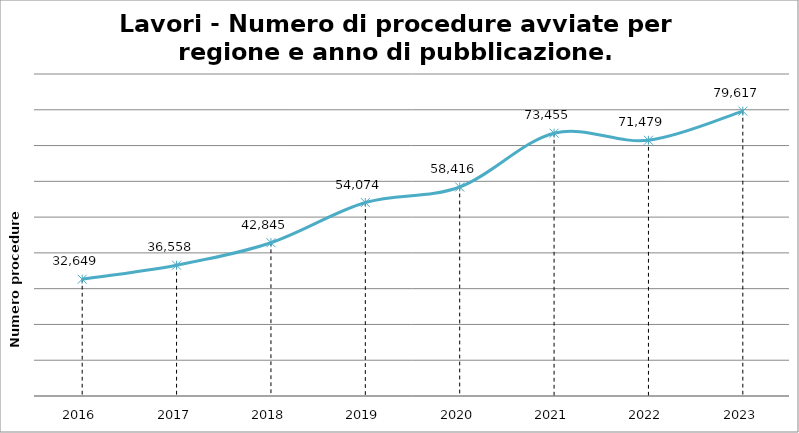
| Category | Totale |
|---|---|
| 2016.0 | 32649 |
| 2017.0 | 36558 |
| 2018.0 | 42845 |
| 2019.0 | 54074 |
| 2020.0 | 58416 |
| 2021.0 | 73455 |
| 2022.0 | 71479 |
| 2023.0 | 79617 |